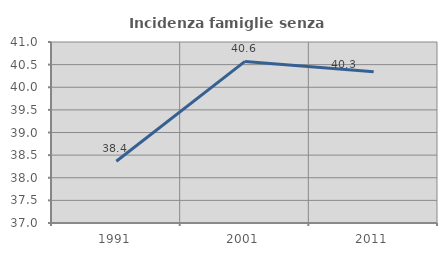
| Category | Incidenza famiglie senza nuclei |
|---|---|
| 1991.0 | 38.365 |
| 2001.0 | 40.571 |
| 2011.0 | 40.341 |